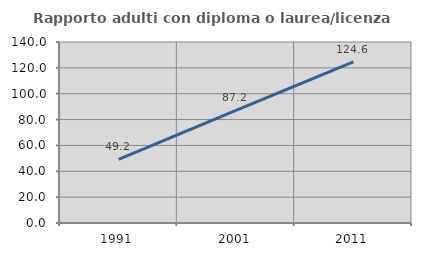
| Category | Rapporto adulti con diploma o laurea/licenza media  |
|---|---|
| 1991.0 | 49.198 |
| 2001.0 | 87.156 |
| 2011.0 | 124.631 |